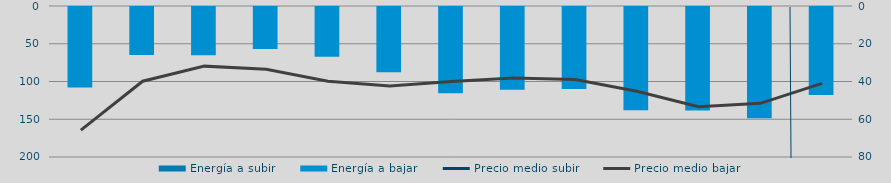
| Category | Energía a subir | Energía a bajar |
|---|---|---|
| D |  | 108041.453 |
| E |  | 65058.027 |
| F |  | 65080.662 |
| M |  | 56832.525 |
| A |  | 67245.511 |
| M |  | 87837.741 |
| J |  | 115472.265 |
| J |  | 110945.08 |
| A |  | 109933.033 |
| S |  | 138127.981 |
| O |  | 138345.883 |
| N |  | 148810.416 |
| D |  | 118042.065 |